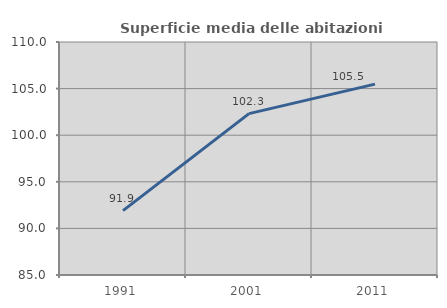
| Category | Superficie media delle abitazioni occupate |
|---|---|
| 1991.0 | 91.901 |
| 2001.0 | 102.318 |
| 2011.0 | 105.481 |